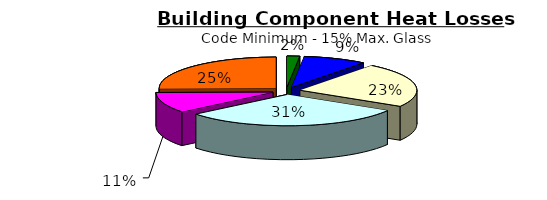
| Category | Series 0 |
|---|---|
| 0 | 554.19 |
| 1 | 2770.95 |
| 2 | 7269.15 |
| 3 | 9650.662 |
| 4 | 3338.528 |
| 5 | 7938.016 |